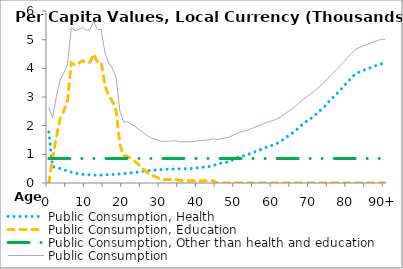
| Category | Public Consumption, Health | Public Consumption, Education | Public Consumption, Other than health and education | Public Consumption |
|---|---|---|---|---|
| 0 | 1780.607 | 0 | 855.829 | 2636.435 |
|  | 568.802 | 860.049 | 855.829 | 2284.681 |
| 2 | 547.456 | 1605.313 | 855.829 | 3008.598 |
| 3 | 504.079 | 2226.036 | 855.829 | 3585.943 |
| 4 | 458.881 | 2516.784 | 855.829 | 3831.493 |
| 5 | 419.225 | 2867.094 | 855.829 | 4142.148 |
| 6 | 380.75 | 4194.694 | 855.829 | 5431.273 |
| 7 | 347.665 | 4109.16 | 855.829 | 5312.653 |
| 8 | 318.881 | 4181.727 | 855.829 | 5356.437 |
| 9 | 301.876 | 4270.62 | 855.829 | 5428.324 |
| 10 | 290.949 | 4182.723 | 855.829 | 5329.501 |
| 11 | 281.45 | 4210.338 | 855.829 | 5347.617 |
| 12 | 275.107 | 4499.482 | 855.829 | 5630.419 |
| 13 | 273.875 | 4229.837 | 855.829 | 5359.541 |
| 14 | 278.285 | 4223.244 | 855.829 | 5357.357 |
| 15 | 284.444 | 3411.633 | 855.829 | 4551.906 |
| 16 | 290.741 | 3038.19 | 855.829 | 4184.76 |
| 17 | 298.163 | 2856.9 | 855.829 | 4010.892 |
| 18 | 307.366 | 2520.95 | 855.829 | 3684.144 |
| 19 | 318.522 | 1348.424 | 855.829 | 2522.775 |
| 20 | 330.28 | 945.273 | 855.829 | 2131.381 |
| 21 | 341.586 | 937.717 | 855.829 | 2135.132 |
| 22 | 352.152 | 840.821 | 855.829 | 2048.802 |
| 23 | 365.686 | 760.677 | 855.829 | 1982.192 |
| 24 | 385.381 | 636.145 | 855.829 | 1877.355 |
| 25 | 407.684 | 519.088 | 855.829 | 1782.601 |
| 26 | 428.514 | 389.29 | 855.829 | 1673.633 |
| 27 | 440.316 | 308.409 | 855.829 | 1604.554 |
| 28 | 447.154 | 246.65 | 855.829 | 1549.633 |
| 29 | 457.08 | 193.942 | 855.829 | 1506.85 |
| 30 | 467.488 | 121.941 | 855.829 | 1445.258 |
| 31 | 476.846 | 120.589 | 855.829 | 1453.264 |
| 32 | 483.1 | 121.648 | 855.829 | 1460.577 |
| 33 | 486.275 | 127.977 | 855.829 | 1470.082 |
| 34 | 489.193 | 125.889 | 855.829 | 1470.911 |
| 35 | 492.412 | 86.439 | 855.829 | 1434.679 |
| 36 | 495.532 | 82.691 | 855.829 | 1434.052 |
| 37 | 498.109 | 79.209 | 855.829 | 1433.147 |
| 38 | 505.621 | 78.544 | 855.829 | 1439.994 |
| 39 | 519.647 | 79.481 | 855.829 | 1454.957 |
| 40 | 535.478 | 76.318 | 855.829 | 1467.624 |
| 41 | 549.917 | 75.084 | 855.829 | 1480.83 |
| 42 | 558.72 | 74.629 | 855.829 | 1489.178 |
| 43 | 577.652 | 76.108 | 855.829 | 1509.588 |
| 44 | 613.42 | 76.15 | 855.829 | 1545.399 |
| 45 | 653.192 | 0 | 855.829 | 1509.021 |
| 46 | 690.118 | 0 | 855.829 | 1545.947 |
| 47 | 708.609 | 0 | 855.829 | 1564.438 |
| 48 | 736.15 | 0 | 855.829 | 1591.978 |
| 49 | 793.761 | 0 | 855.829 | 1649.59 |
| 50 | 856.993 | 0 | 855.829 | 1712.822 |
| 51 | 912.726 | 0 | 855.829 | 1768.555 |
| 52 | 944.588 | 0 | 855.829 | 1800.417 |
| 53 | 979.902 | 0 | 855.829 | 1835.731 |
| 54 | 1032.386 | 0 | 855.829 | 1888.215 |
| 55 | 1081.545 | 0 | 855.829 | 1937.374 |
| 56 | 1129.865 | 0 | 855.829 | 1985.693 |
| 57 | 1182.784 | 0 | 855.829 | 2038.612 |
| 58 | 1237.847 | 0 | 855.829 | 2093.676 |
| 59 | 1282.681 | 0 | 855.829 | 2138.51 |
| 60 | 1323.983 | 0 | 855.829 | 2179.812 |
| 61 | 1373.647 | 0 | 855.829 | 2229.476 |
| 62 | 1448.641 | 0 | 855.829 | 2304.47 |
| 63 | 1542.486 | 0 | 855.829 | 2398.315 |
| 64 | 1635.587 | 0 | 855.829 | 2491.416 |
| 65 | 1724.578 | 0 | 855.829 | 2580.407 |
| 66 | 1824.104 | 0 | 855.829 | 2679.933 |
| 67 | 1940.974 | 0 | 855.829 | 2796.803 |
| 68 | 2057.086 | 0 | 855.829 | 2912.915 |
| 69 | 2155.103 | 0 | 855.829 | 3010.932 |
| 70 | 2239.035 | 0 | 855.829 | 3094.863 |
| 71 | 2340.686 | 0 | 855.829 | 3196.514 |
| 72 | 2458.503 | 0 | 855.829 | 3314.332 |
| 73 | 2573.507 | 0 | 855.829 | 3429.336 |
| 74 | 2696.095 | 0 | 855.829 | 3551.924 |
| 75 | 2847.792 | 0 | 855.829 | 3703.621 |
| 76 | 2981.874 | 0 | 855.829 | 3837.703 |
| 77 | 3104.523 | 0 | 855.829 | 3960.351 |
| 78 | 3239.693 | 0 | 855.829 | 4095.522 |
| 79 | 3382.991 | 0 | 855.829 | 4238.82 |
| 80 | 3527.477 | 0 | 855.829 | 4383.306 |
| 81 | 3667.843 | 0 | 855.829 | 4523.672 |
| 82 | 3803.655 | 0 | 855.829 | 4659.483 |
| 83 | 3864.856 | 0 | 855.829 | 4720.685 |
| 84 | 3919.851 | 0 | 855.829 | 4775.68 |
| 85 | 3969.207 | 0 | 855.829 | 4825.036 |
| 86 | 4017.336 | 0 | 855.829 | 4873.165 |
| 87 | 4066.136 | 0 | 855.829 | 4921.965 |
| 88 | 4113.209 | 0 | 855.829 | 4969.038 |
| 89 | 4156.169 | 0 | 855.829 | 5011.998 |
| 90+ | 4155.964 | 0 | 855.829 | 5011.793 |